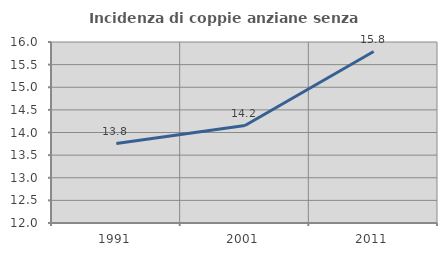
| Category | Incidenza di coppie anziane senza figli  |
|---|---|
| 1991.0 | 13.757 |
| 2001.0 | 14.154 |
| 2011.0 | 15.789 |